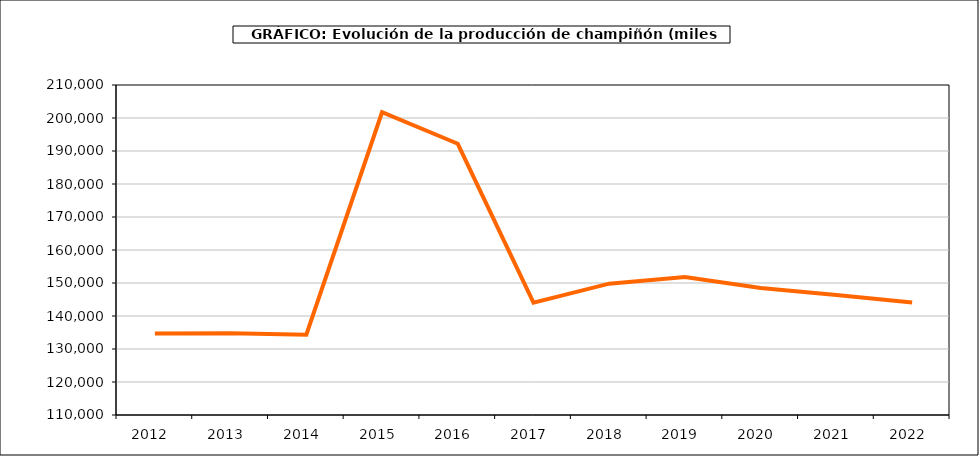
| Category | producción |
|---|---|
| 2012.0 | 134676 |
| 2013.0 | 134768 |
| 2014.0 | 134317 |
| 2015.0 | 201740 |
| 2016.0 | 192191 |
| 2017.0 | 144052 |
| 2018.0 | 149800 |
| 2019.0 | 151823 |
| 2020.0 | 148495 |
| 2021.0 | 146349 |
| 2022.0 | 144106 |